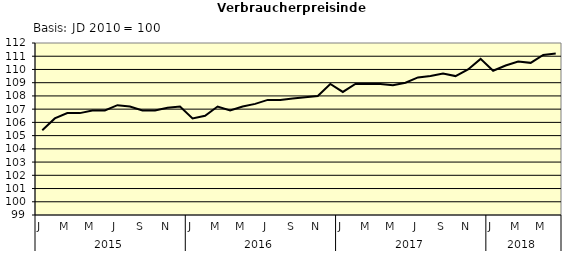
| Category | Series 0 |
|---|---|
| 0 | 105.4 |
| 1 | 106.3 |
| 2 | 106.7 |
| 3 | 106.7 |
| 4 | 106.9 |
| 5 | 106.9 |
| 6 | 107.3 |
| 7 | 107.2 |
| 8 | 106.9 |
| 9 | 106.9 |
| 10 | 107.1 |
| 11 | 107.2 |
| 12 | 106.3 |
| 13 | 106.5 |
| 14 | 107.2 |
| 15 | 106.9 |
| 16 | 107.2 |
| 17 | 107.4 |
| 18 | 107.7 |
| 19 | 107.7 |
| 20 | 107.8 |
| 21 | 107.9 |
| 22 | 108 |
| 23 | 108.9 |
| 24 | 108.3 |
| 25 | 108.9 |
| 26 | 108.9 |
| 27 | 108.9 |
| 28 | 108.8 |
| 29 | 109 |
| 30 | 109.4 |
| 31 | 109.5 |
| 32 | 109.7 |
| 33 | 109.5 |
| 34 | 110 |
| 35 | 110.8 |
| 36 | 109.9 |
| 37 | 110.3 |
| 38 | 110.6 |
| 39 | 110.5 |
| 40 | 111.1 |
| 41 | 111.2 |